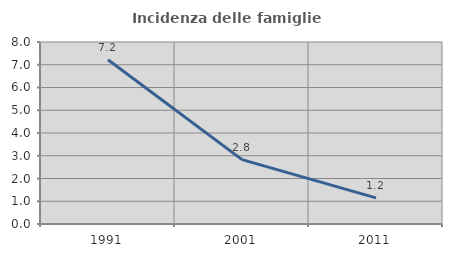
| Category | Incidenza delle famiglie numerose |
|---|---|
| 1991.0 | 7.22 |
| 2001.0 | 2.829 |
| 2011.0 | 1.151 |